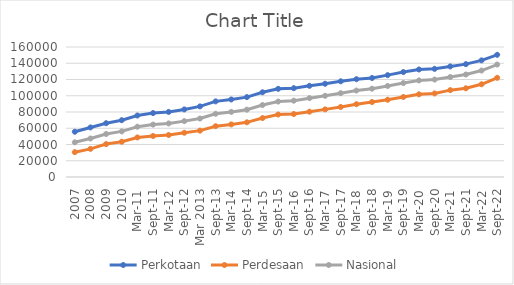
| Category | Perkotaan | Perdesaan | Nasional |
|---|---|---|---|
| 2007 | 55683 | 30572 | 42704 |
| 2008 | 60999 | 34624 | 47366 |
| 2009 | 66214 | 40503 | 52923 |
| 2010 | 69912 | 43415 | 56111 |
| Mar-11 | 75674 | 48674 | 61906 |
| Sep-11 | 78675 | 50458 | 64525 |
| Mar-12 | 80123 | 51705 | 65910 |
| Sep-12 | 83175 | 54474 | 68762 |
| Mar 2013 | 86904 | 57058 | 71935 |
| Sep-13 | 93076 | 62529 | 77829 |
| Mar-14 | 95423 | 64718 | 80107 |
| Sep-14 | 98319 | 67290 | 82859 |
| Mar-15 | 104263 | 72524 | 88535 |
| Sep-15 | 108538 | 76914 | 92866 |
| Mar-16 | 109346 | 77514 | 93917 |
| Sep-16 | 112228 | 80382 | 97050 |
| Mar-17 | 114765 | 83218 | 99933 |
| Sep-17 | 117775 | 86169 | 103196 |
| Mar-18 | 120342 | 89606 | 106414 |
| Sep-18 | 121860.22 | 92270.22 | 108647.91 |
| Mar-19 | 125375 | 95111 | 112018 |
| Sep-19 | 129160 | 98495 | 115627 |
| Mar-20 | 132303 | 101788 | 118859 |
| Sep-20 | 133121 | 102860 | 119943 |
| Mar-21 | 136081 | 106908 | 123051 |
| Sep-21 | 138894 | 109175 | 126161 |
| Mar-22 | 143536 | 114113 | 131014 |
| Sep-22 | 150380 | 122077 | 138422 |